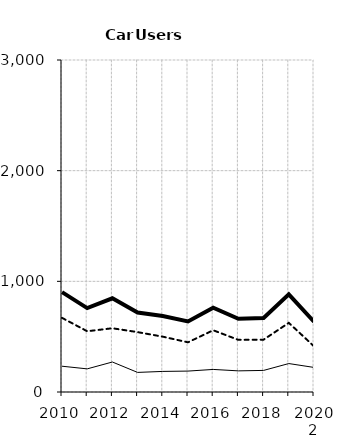
| Category | Built-up | Non built-up | Total |
|---|---|---|---|
| 2010 | 233 | 670 | 903 |
| 2011 | 209 | 549 | 758 |
| 2012 | 271 | 576 | 847 |
| 2013 | 177 | 541 | 718 |
| 2014 | 186 | 500 | 686 |
| 2015 | 189 | 449 | 638 |
| 2016 | 204 | 558 | 762 |
| 2017 | 191 | 471 | 662 |
| 2018 | 195 | 473 | 668 |
| 2019 2 | 257 | 625 | 882 |
| 2020 2 | 222 | 413 | 635 |